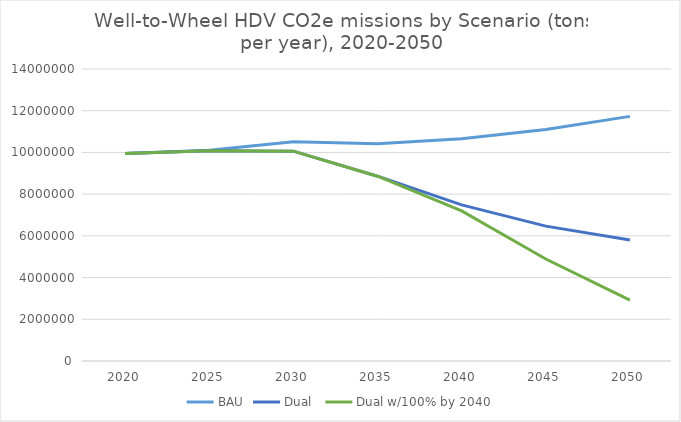
| Category | BAU | Dual  | Dual w/100% by 2040 |
|---|---|---|---|
| 2020.0 | 9945933.103 | 9945933.103 | 9945933.103 |
| 2025.0 | 10109418.774 | 10076470.394 | 10076470.394 |
| 2030.0 | 10509589.209 | 10059930.313 | 10059930.313 |
| 2035.0 | 10420018.472 | 8860879.876 | 8860879.876 |
| 2040.0 | 10651415.469 | 7486137.593 | 7196995.807 |
| 2045.0 | 11100020.534 | 6465260.303 | 4891001.139 |
| 2050.0 | 11727966.06 | 5799489.734 | 2922449.07 |